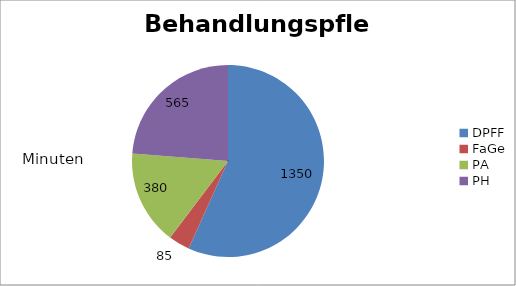
| Category | Behandlungspflege |
|---|---|
| DPFF | 1350 |
| FaGe | 85 |
| PA | 380 |
| PH | 565 |